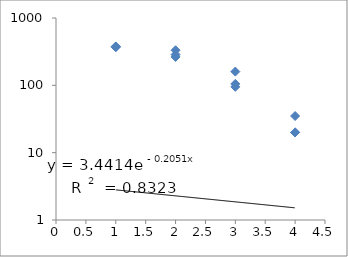
| Category | Series 0 |
|---|---|
| 1.0 | 368 |
| 1.0 | 374 |
| 1.0 | 378 |
| 2.0 | 286 |
| 2.0 | 264 |
| 2.0 | 332 |
| 3.0 | 95 |
| 3.0 | 160 |
| 3.0 | 105 |
| 4.0 | 20 |
| 4.0 | 35 |
| 4.0 | 20 |